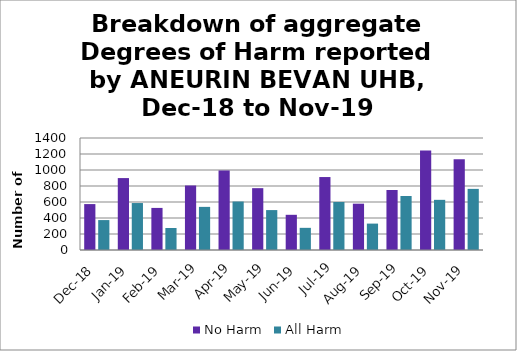
| Category | No Harm | All Harm |
|---|---|---|
| Dec-18 | 574 | 374 |
| Jan-19 | 899 | 587 |
| Feb-19 | 526 | 275 |
| Mar-19 | 805 | 539 |
| Apr-19 | 994 | 606 |
| May-19 | 773 | 499 |
| Jun-19 | 440 | 277 |
| Jul-19 | 912 | 600 |
| Aug-19 | 579 | 330 |
| Sep-19 | 750 | 675 |
| Oct-19 | 1245 | 627 |
| Nov-19 | 1135 | 764 |